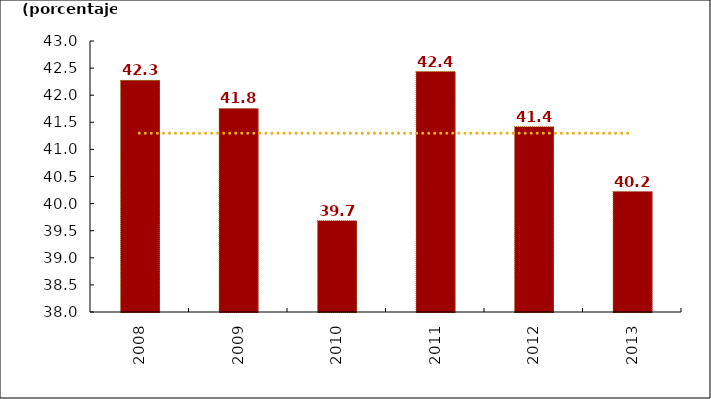
| Category | Participación base supersociedades |
|---|---|
| 2008.0 | 42.274 |
| 2009.0 | 41.756 |
| 2010.0 | 39.685 |
| 2011.0 | 42.436 |
| 2012.0 | 41.419 |
| 2013.0 | 40.222 |